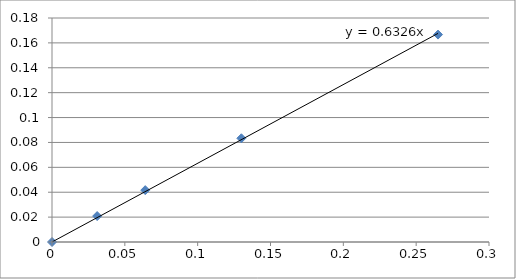
| Category | Series 0 |
|---|---|
| 0.0 | 0 |
| 0.031 | 0.021 |
| 0.064 | 0.042 |
| 0.13 | 0.083 |
| 0.265 | 0.167 |